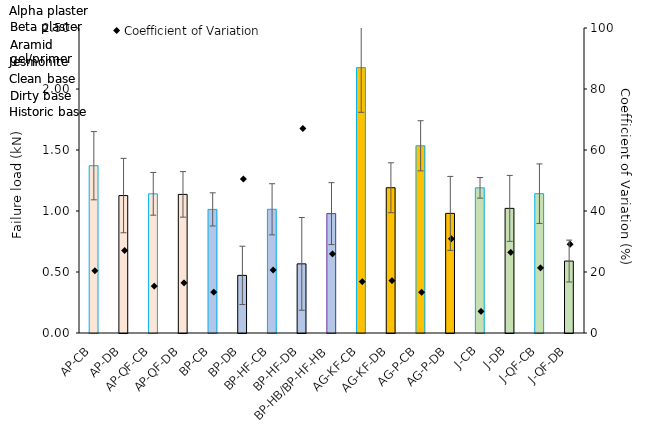
| Category | Mean |
|---|---|
| AP-CB | 1.371 |
| AP-DB | 1.126 |
| AP-QF-CB | 1.141 |
| AP-QF-DB | 1.136 |
| BP-CB | 1.013 |
| BP-DB | 0.472 |
| BP-HF-CB | 1.014 |
| BP-HF-DB | 0.567 |
| BP-HB/BP-HF-HB | 0.979 |
| AG-KF-CB | 2.175 |
| AG-KF-DB | 1.191 |
| AG-P-CB | 1.535 |
| AG-P-DB | 0.98 |
| J-CB | 1.19 |
| J-DB | 1.022 |
| J-QF-CB | 1.142 |
| J-QF-DB | 0.59 |